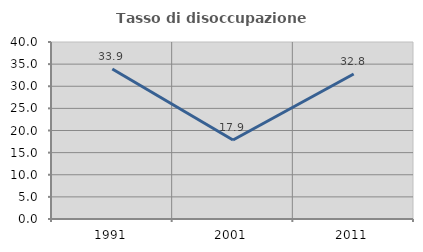
| Category | Tasso di disoccupazione giovanile  |
|---|---|
| 1991.0 | 33.913 |
| 2001.0 | 17.857 |
| 2011.0 | 32.759 |